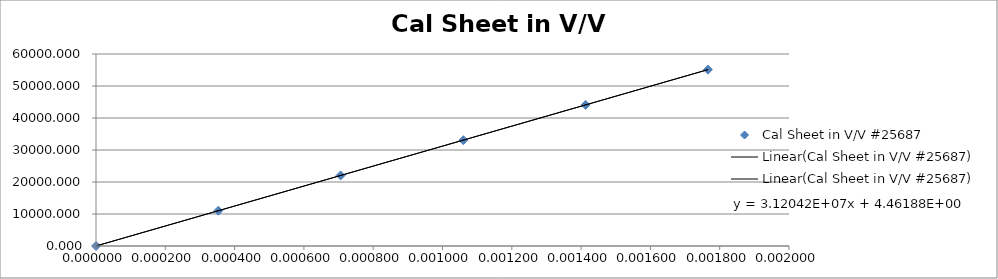
| Category | Cal Sheet in V/V #25687 |
|---|---|
| 0.0 | 0 |
| 0.000353 | 11023.113 |
| 0.000706 | 22046.226 |
| 0.00106 | 33069.339 |
| 0.001413 | 44092.452 |
| 0.001766 | 55115.566 |